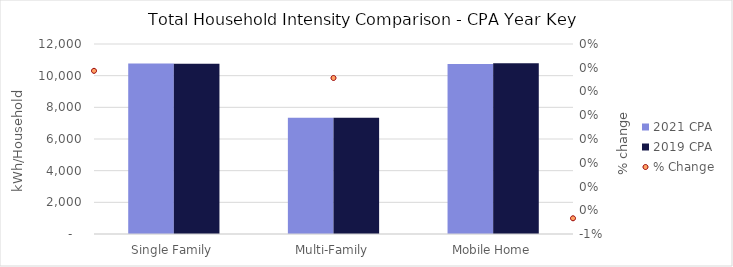
| Category | 2021 CPA | 2019 CPA |
|---|---|---|
| Single Family | 10773.225 | 10753.113 |
| Multi-Family | 7346.051 | 7334.543 |
| Mobile Home | 10742.623 | 10789.429 |